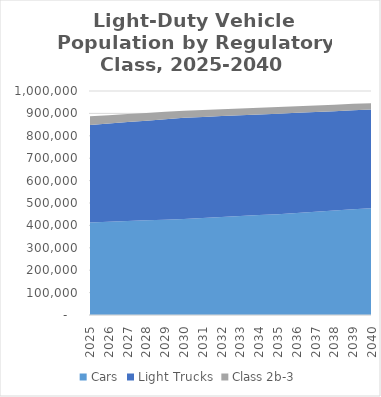
| Category | Cars | Light Trucks | Class 2b-3 |
|---|---|---|---|
| 2025.0 | 412648.791 | 435686.038 | 38922.173 |
| 2026.0 | 415920 | 438870 | 37360 |
| 2027.0 | 419200 | 442050 | 35800 |
| 2028.0 | 422470 | 445240 | 34230 |
| 2029.0 | 425750 | 448420 | 32670 |
| 2030.0 | 429021.219 | 451602.157 | 31105.95 |
| 2031.0 | 433260 | 451000 | 30840 |
| 2032.0 | 437500 | 450390 | 30570 |
| 2033.0 | 441740 | 449780 | 30300 |
| 2034.0 | 445990 | 449180 | 30030 |
| 2035.0 | 450226.827 | 448569.735 | 29756.123 |
| 2036.0 | 455580 | 446980 | 29480 |
| 2037.0 | 460940 | 445400 | 29200 |
| 2038.0 | 466290 | 443810 | 28920 |
| 2039.0 | 471650 | 442230 | 28650 |
| 2040.0 | 477000.053 | 440644.249 | 28370.11 |